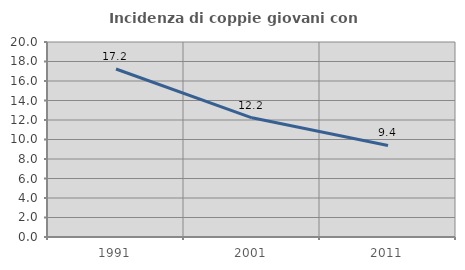
| Category | Incidenza di coppie giovani con figli |
|---|---|
| 1991.0 | 17.228 |
| 2001.0 | 12.226 |
| 2011.0 | 9.394 |